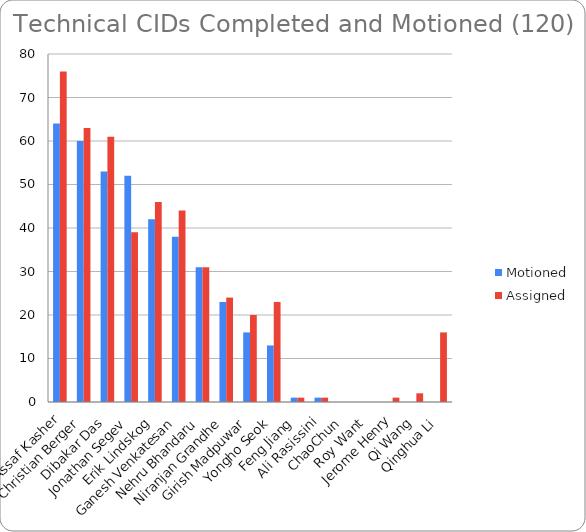
| Category | Motioned | Assigned |
|---|---|---|
| Assaf Kasher | 64 | 76 |
| Christian Berger | 60 | 63 |
| Dibakar Das | 53 | 61 |
| Jonathan Segev | 52 | 39 |
| Erik Lindskog | 42 | 46 |
| Ganesh Venkatesan | 38 | 44 |
| Nehru Bhandaru | 31 | 31 |
| Niranjan Grandhe | 23 | 24 |
| Girish Madpuwar | 16 | 20 |
| Yongho Seok | 13 | 23 |
| Feng Jiang | 1 | 1 |
| Ali Rasissini | 1 | 1 |
| ChaoChun | 0 | 0 |
| Roy Want | 0 | 0 |
| Jerome Henry | 0 | 1 |
| Qi Wang | 0 | 2 |
| Qinghua Li | 0 | 16 |